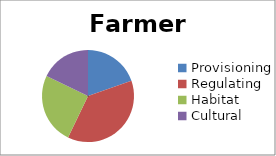
| Category | Farmers | Citizens | Total |
|---|---|---|---|
| Provisioning | 11 | 12 | 23 |
| Regulating | 21 | 19 | 40 |
| Habitat | 14 | 17 | 31 |
| Cultural | 10 | 42 | 52 |